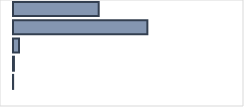
| Category | Series 0 |
|---|---|
| 0 | 37.747 |
| 1 | 59.192 |
| 2 | 2.588 |
| 3 | 0.418 |
| 4 | 0.055 |